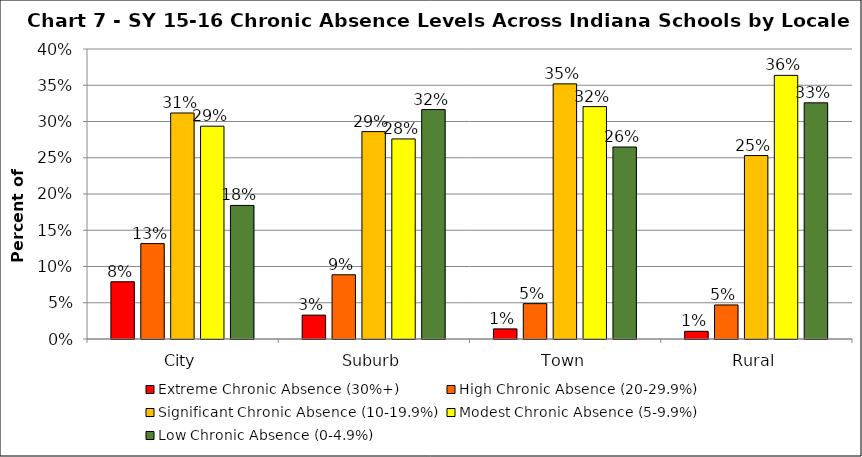
| Category | Extreme Chronic Absence (30%+) | High Chronic Absence (20-29.9%) | Significant Chronic Absence (10-19.9%) | Modest Chronic Absence (5-9.9%) | Low Chronic Absence (0-4.9%) |
|---|---|---|---|---|---|
| 0 | 0.079 | 0.132 | 0.312 | 0.294 | 0.184 |
| 1 | 0.033 | 0.089 | 0.286 | 0.276 | 0.316 |
| 2 | 0.014 | 0.049 | 0.352 | 0.321 | 0.265 |
| 3 | 0.011 | 0.047 | 0.253 | 0.364 | 0.326 |